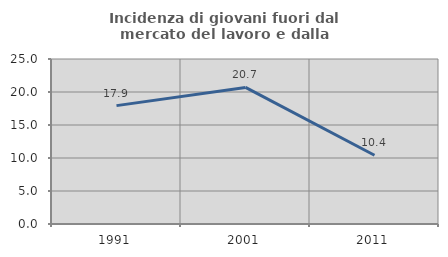
| Category | Incidenza di giovani fuori dal mercato del lavoro e dalla formazione  |
|---|---|
| 1991.0 | 17.936 |
| 2001.0 | 20.694 |
| 2011.0 | 10.419 |